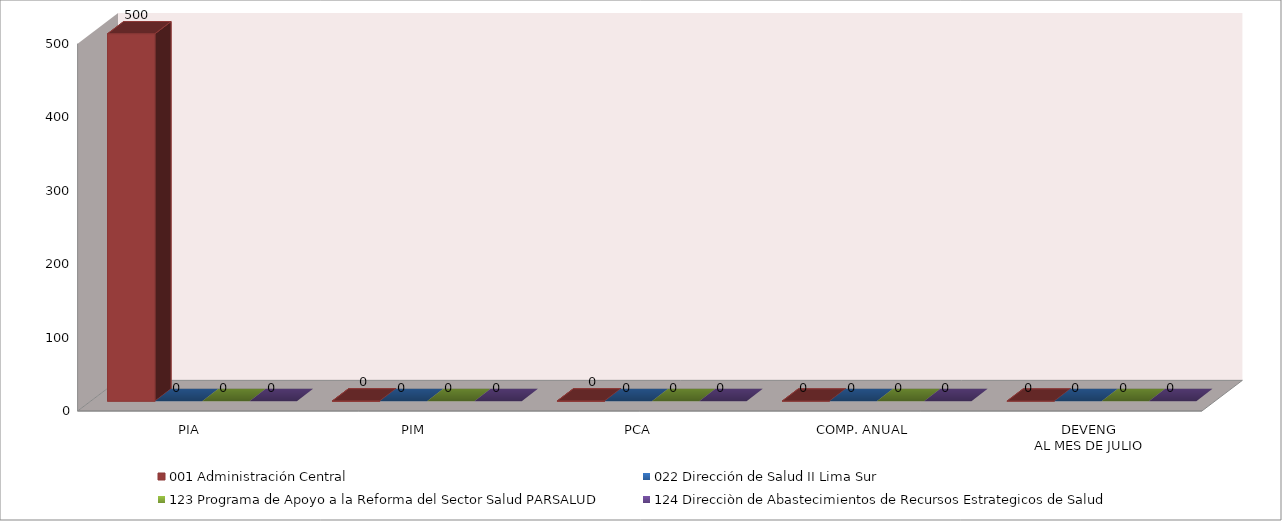
| Category | 001 Administración Central | 022 Dirección de Salud II Lima Sur | 123 Programa de Apoyo a la Reforma del Sector Salud PARSALUD | 124 Direcciòn de Abastecimientos de Recursos Estrategicos de Salud |
|---|---|---|---|---|
| PIA | 500 | 0 | 0 | 0 |
| PIM | 0.236 | 0 | 0 | 0 |
| PCA | 0.224 | 0 | 0 | 0 |
| COMP. ANUAL | 0 | 0 | 0 | 0 |
| DEVENG
AL MES DE JULIO | 0 | 0 | 0 | 0 |